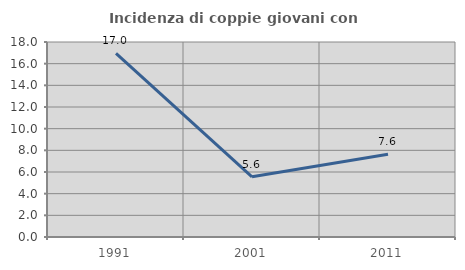
| Category | Incidenza di coppie giovani con figli |
|---|---|
| 1991.0 | 16.959 |
| 2001.0 | 5.556 |
| 2011.0 | 7.634 |